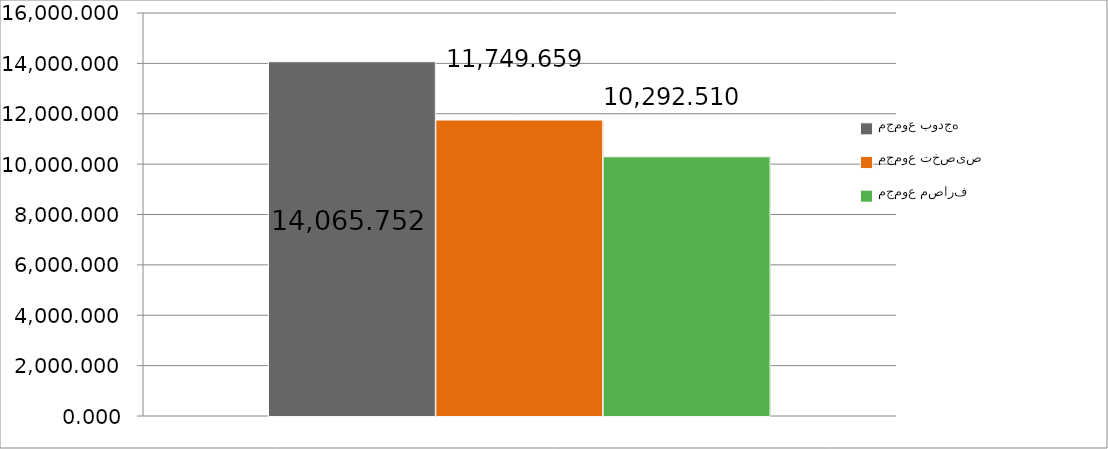
| Category | مجموع بودجه  | مجموع تخصیص | مجموع مصارف |
|---|---|---|---|
| 0 | 14065.752 | 11749.659 | 10292.51 |